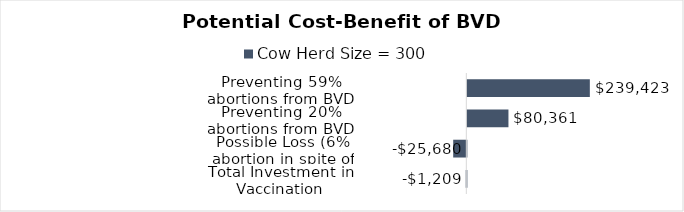
| Category | Cow Herd Size = 300 |
|---|---|
| Total Investment in Vaccination | -1209 |
| Possible Loss (6% abortion in spite of vaccination)     | -25680 |
| Preventing 20% abortions from BVD could save: | 80361 |
| Preventing 59% abortions from BVD could save: | 239422.5 |